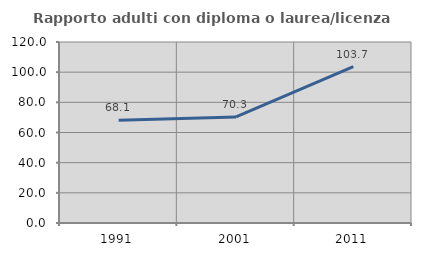
| Category | Rapporto adulti con diploma o laurea/licenza media  |
|---|---|
| 1991.0 | 68.085 |
| 2001.0 | 70.29 |
| 2011.0 | 103.731 |